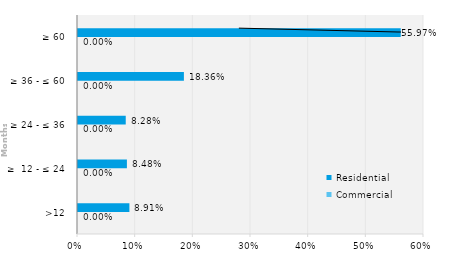
| Category | Commercial | Residential |
|---|---|---|
| >12 | 0 | 0.089 |
| ≥  12 - ≤ 24 | 0 | 0.085 |
| ≥ 24 - ≤ 36 | 0 | 0.083 |
| ≥ 36 - ≤ 60 | 0 | 0.184 |
| ≥ 60 | 0 | 0.56 |